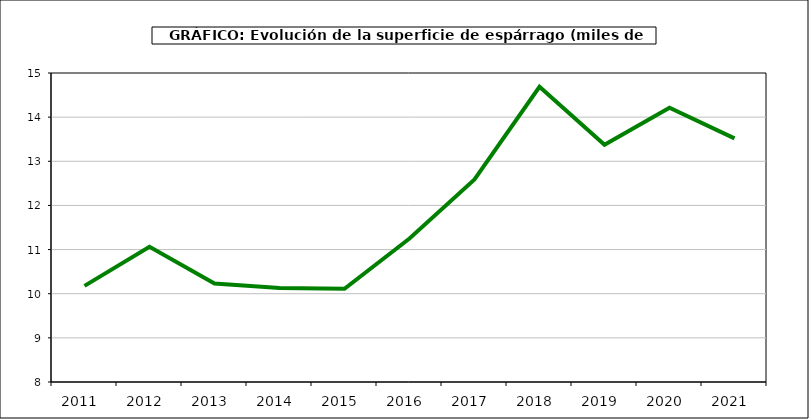
| Category | superficie |
|---|---|
| 2011.0 | 10.178 |
| 2012.0 | 11.065 |
| 2013.0 | 10.231 |
| 2014.0 | 10.132 |
| 2015.0 | 10.112 |
| 2016.0 | 11.251 |
| 2017.0 | 12.589 |
| 2018.0 | 14.688 |
| 2019.0 | 13.373 |
| 2020.0 | 14.215 |
| 2021.0 | 13.52 |